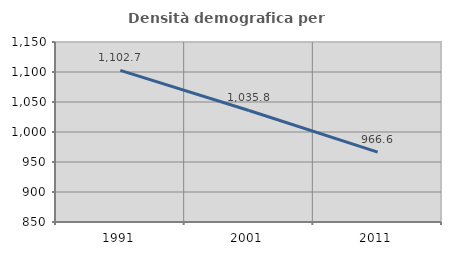
| Category | Densità demografica |
|---|---|
| 1991.0 | 1102.749 |
| 2001.0 | 1035.849 |
| 2011.0 | 966.56 |